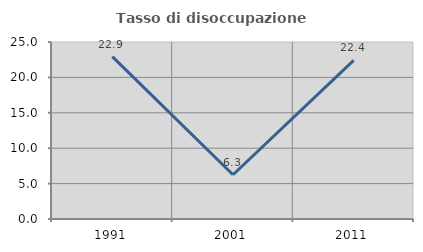
| Category | Tasso di disoccupazione giovanile  |
|---|---|
| 1991.0 | 22.936 |
| 2001.0 | 6.25 |
| 2011.0 | 22.414 |